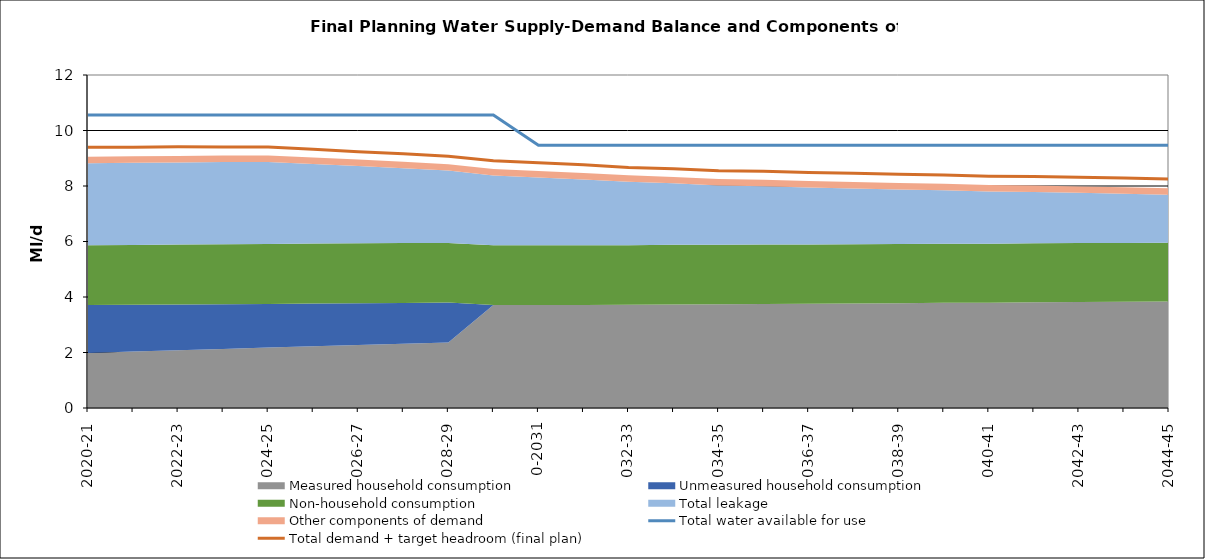
| Category | Total water available for use | Total demand + target headroom (final plan) |
|---|---|---|
| 0 | 10.56 | 9.399 |
| 1 | 10.56 | 9.398 |
| 2 | 10.56 | 9.412 |
| 3 | 10.56 | 9.404 |
| 4 | 10.56 | 9.409 |
| 5 | 10.56 | 9.322 |
| 6 | 10.56 | 9.237 |
| 7 | 10.56 | 9.166 |
| 8 | 10.56 | 9.072 |
| 9 | 10.56 | 8.906 |
| 10 | 9.47 | 8.835 |
| 11 | 9.47 | 8.762 |
| 12 | 9.47 | 8.668 |
| 13 | 9.47 | 8.623 |
| 14 | 9.47 | 8.552 |
| 15 | 9.47 | 8.529 |
| 16 | 9.47 | 8.487 |
| 17 | 9.47 | 8.459 |
| 18 | 9.47 | 8.421 |
| 19 | 9.47 | 8.399 |
| 20 | 9.47 | 8.355 |
| 21 | 9.47 | 8.344 |
| 22 | 9.47 | 8.313 |
| 23 | 9.47 | 8.289 |
| 24 | 9.47 | 8.255 |